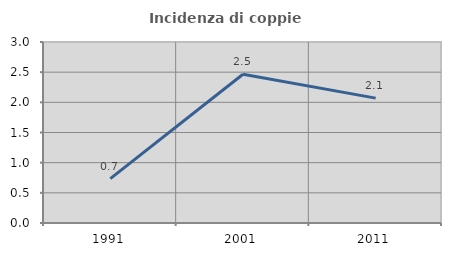
| Category | Incidenza di coppie miste |
|---|---|
| 1991.0 | 0.735 |
| 2001.0 | 2.466 |
| 2011.0 | 2.07 |